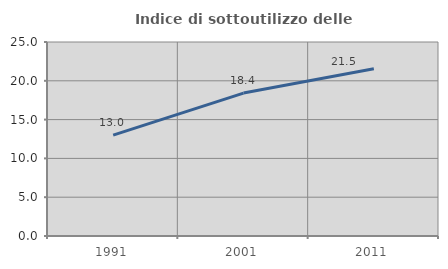
| Category | Indice di sottoutilizzo delle abitazioni  |
|---|---|
| 1991.0 | 12.991 |
| 2001.0 | 18.417 |
| 2011.0 | 21.542 |